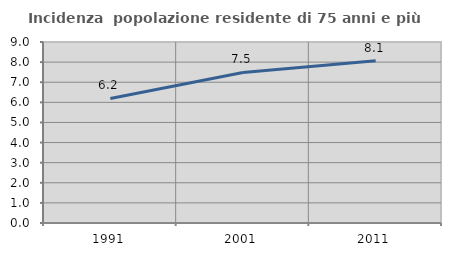
| Category | Incidenza  popolazione residente di 75 anni e più |
|---|---|
| 1991.0 | 6.192 |
| 2001.0 | 7.485 |
| 2011.0 | 8.066 |